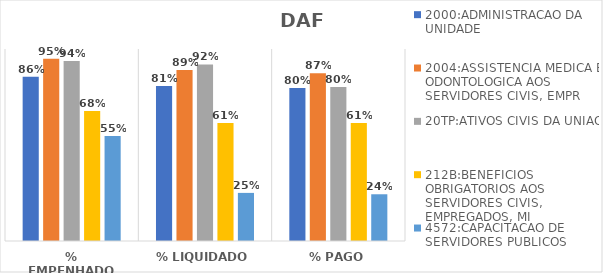
| Category | 2000:ADMINISTRACAO DA UNIDADE | 2004:ASSISTENCIA MEDICA E ODONTOLOGICA AOS SERVIDORES CIVIS, EMPR | 20TP:ATIVOS CIVIS DA UNIAO | 212B:BENEFICIOS OBRIGATORIOS AOS SERVIDORES CIVIS, EMPREGADOS, MI | 4572:CAPACITACAO DE SERVIDORES PUBLICOS FEDERAIS EM PROCESSO DE Q |
|---|---|---|---|---|---|
| % EMPENHADO | 0.856 | 0.949 | 0.938 | 0.677 | 0.547 |
| % LIQUIDADO | 0.807 | 0.891 | 0.92 | 0.615 | 0.251 |
| % PAGO | 0.796 | 0.874 | 0.802 | 0.614 | 0.243 |